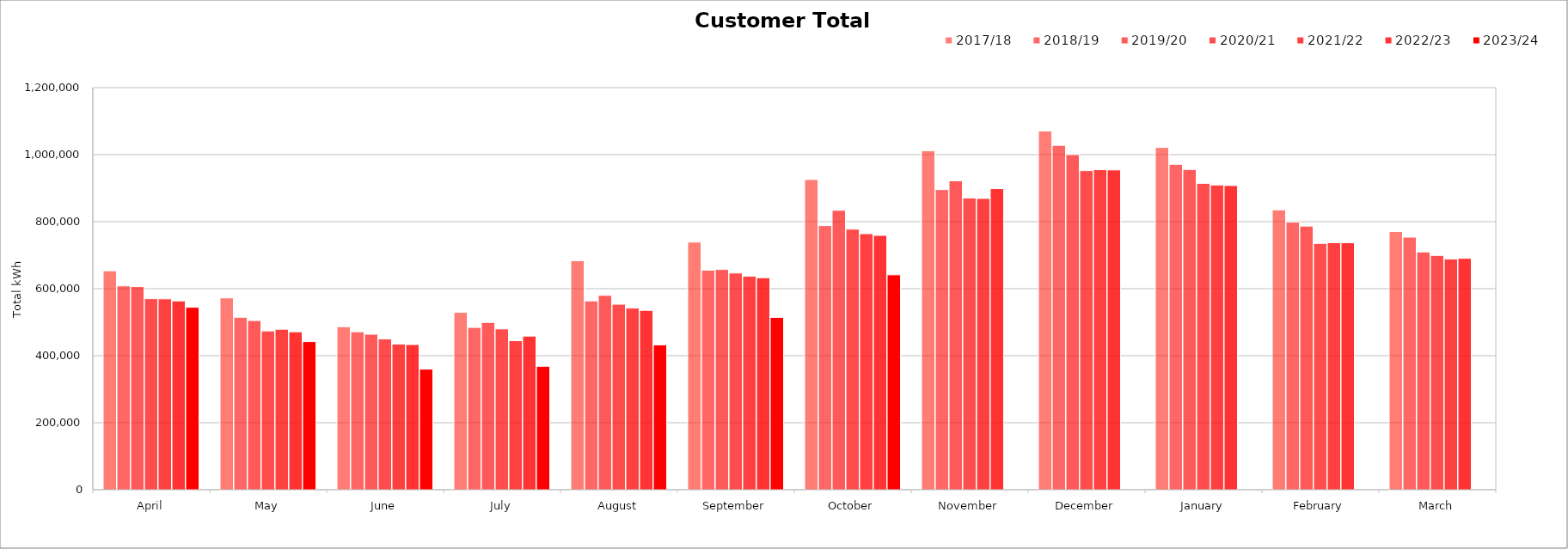
| Category | 2017/18 | 2018/19 | 2019/20 | 2020/21 | 2021/22 | 2022/23 | 2023/24 |
|---|---|---|---|---|---|---|---|
| April | 653308.8 | 608320.6 | 606271.1 | 570233.9 | 569668.091 | 563388.364 | 544534.127 |
| May | 572443 | 514640.7 | 504884 | 473988 | 479049.313 | 471355.353 | 442065.25 |
| June | 486520.7 | 471456.2 | 464015.4 | 450246.7 | 434778.299 | 433209.342 | 359854.746 |
| July | 529342.5 | 484326.5 | 499214.6 | 479954.3 | 444771.387 | 458503.367 | 368283.708 |
| August | 683381 | 563436 | 580019 | 553636.1 | 542022.106 | 535348.884 | 432327.545 |
| September | 738923.3 | 655075.9 | 657321.5 | 646764.7 | 637236.042 | 632682.151 | 514270.972 |
| October | 925863 | 788254.5 | 833834.5 | 777720.4 | 764104.835 | 759002.817 | 641351.737 |
| November | 1011371.7 | 895643.1 | 922001.2 | 870526.1 | 869381.462 | 898571.863 | 0 |
| December | 1070734.1 | 1027806.6 | 999966.6 | 952297.8 | 955094.808 | 954289.517 | 0 |
| January | 1021460.8 | 971135.4 | 955757.6 | 914361.4 | 909512.903 | 907870.077 | 0 |
| February | 835304.3 | 798696.6 | 786779.8 | 735208.805 | 737342.481 | 736999.893 | 0 |
| March | 770660.3 | 753805.8 | 709531.4 | 699175.528 | 688681.054 | 690605.81 | 0 |